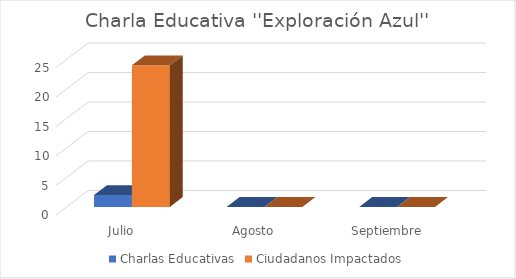
| Category | Charlas Educativas | Ciudadanos Impactados |
|---|---|---|
| Julio | 2 | 24 |
| Agosto | 0 | 0 |
| Septiembre | 0 | 0 |